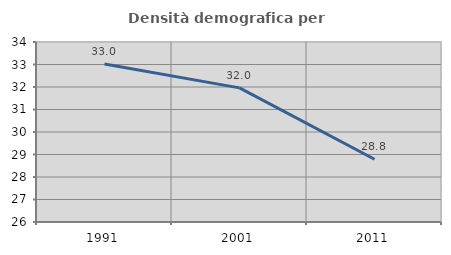
| Category | Densità demografica |
|---|---|
| 1991.0 | 33.018 |
| 2001.0 | 31.961 |
| 2011.0 | 28.788 |